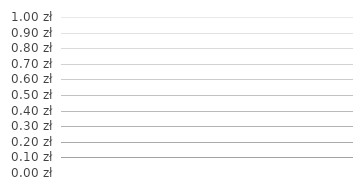
| Category | Series 0 | Series 1 |
|---|---|---|
| 0 | 0 | 0 |